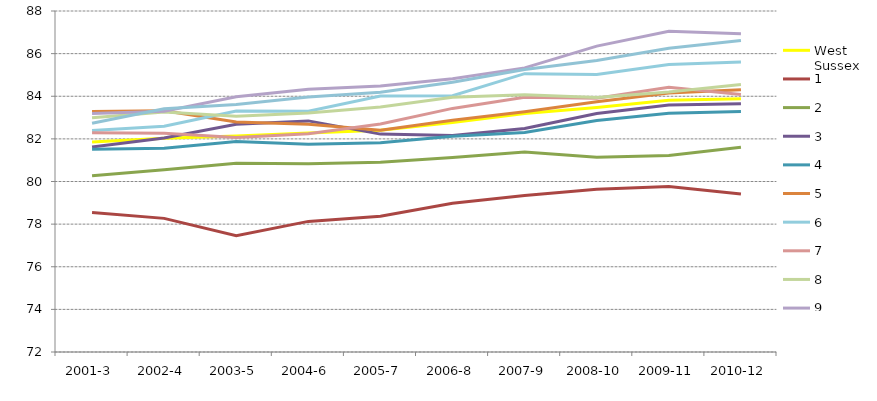
| Category | West Sussex | 1 | 2 | 3 | 4 | 5 | 6 | 7 | 8 | 9 | 10 |
|---|---|---|---|---|---|---|---|---|---|---|---|
| 2001-3 | 81.85 | 78.544 | 80.27 | 81.614 | 81.513 | 83.282 | 82.397 | 82.288 | 82.986 | 83.19 | 82.733 |
| 2002-4 | 82.024 | 78.27 | 80.552 | 82.042 | 81.564 | 83.323 | 82.596 | 82.262 | 83.259 | 83.296 | 83.417 |
| 2003-5 | 82.13 | 77.452 | 80.861 | 82.683 | 81.873 | 82.796 | 83.307 | 82.059 | 83.057 | 83.971 | 83.616 |
| 2004-6 | 82.278 | 78.128 | 80.83 | 82.843 | 81.749 | 82.687 | 83.292 | 82.24 | 83.214 | 84.33 | 83.968 |
| 2005-7 | 82.405 | 78.365 | 80.905 | 82.223 | 81.816 | 82.401 | 84.012 | 82.7 | 83.5 | 84.485 | 84.183 |
| 2006-8 | 82.769 | 78.979 | 81.13 | 82.156 | 82.127 | 82.872 | 84.027 | 83.43 | 83.955 | 84.82 | 84.654 |
| 2007-9 | 83.189 | 79.34 | 81.385 | 82.491 | 82.296 | 83.268 | 85.06 | 83.95 | 84.068 | 85.331 | 85.253 |
| 2008-10 | 83.467 | 79.631 | 81.142 | 83.193 | 82.865 | 83.738 | 85.018 | 83.904 | 83.945 | 86.353 | 85.679 |
| 2009-11 | 83.807 | 79.766 | 81.216 | 83.585 | 83.198 | 84.148 | 85.491 | 84.42 | 84.204 | 87.045 | 86.251 |
| 2010-12 | 83.879 | 79.419 | 81.609 | 83.652 | 83.284 | 84.305 | 85.605 | 84.083 | 84.551 | 86.934 | 86.619 |